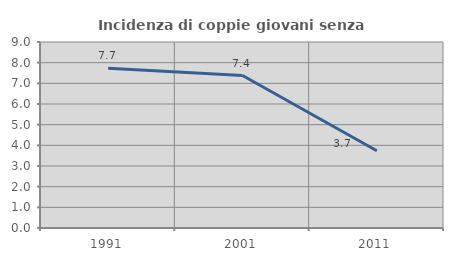
| Category | Incidenza di coppie giovani senza figli |
|---|---|
| 1991.0 | 7.727 |
| 2001.0 | 7.376 |
| 2011.0 | 3.735 |